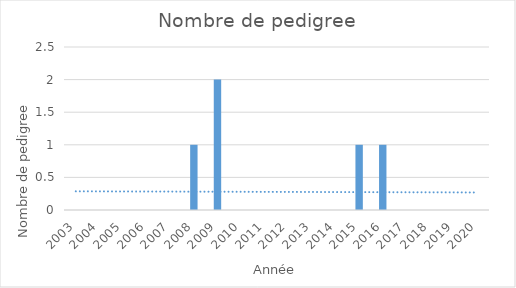
| Category | Series 0 |
|---|---|
| 2003.0 | 0 |
| 2004.0 | 0 |
| 2005.0 | 0 |
| 2006.0 | 0 |
| 2007.0 | 0 |
| 2008.0 | 1 |
| 2009.0 | 2 |
| 2010.0 | 0 |
| 2011.0 | 0 |
| 2012.0 | 0 |
| 2013.0 | 0 |
| 2014.0 | 0 |
| 2015.0 | 1 |
| 2016.0 | 1 |
| 2017.0 | 0 |
| 2018.0 | 0 |
| 2019.0 | 0 |
| 2020.0 | 0 |